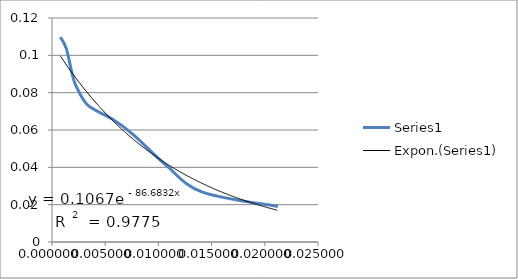
| Category | Series 0 |
|---|---|
| 0.0007811786667207743 | 0.11 |
| 0.0013523402301489369 | 0.103 |
| 0.001991753885188709 | 0.088 |
| 0.002465521579031631 | 0.081 |
| 0.003437826275178894 | 0.073 |
| 0.005669234540628575 | 0.066 |
| 0.007662017729327101 | 0.057 |
| 0.010709420139484107 | 0.041 |
| 0.014141498414817287 | 0.027 |
| 0.021224617429202414 | 0.019 |